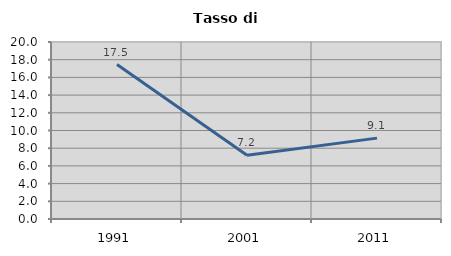
| Category | Tasso di disoccupazione   |
|---|---|
| 1991.0 | 17.453 |
| 2001.0 | 7.201 |
| 2011.0 | 9.138 |